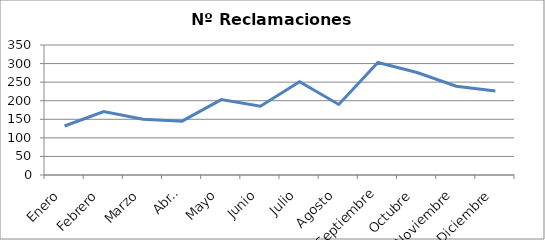
| Category | Nº Reclamaciones |
|---|---|
| Enero | 132 |
| Febrero | 171 |
| Marzo | 150 |
| Abril | 145 |
| Mayo | 203 |
| Junio | 185 |
| Julio | 251 |
| Agosto | 190 |
| Septiembre | 303 |
| Octubre | 276 |
| Noviembre | 239 |
| Diciembre | 226 |